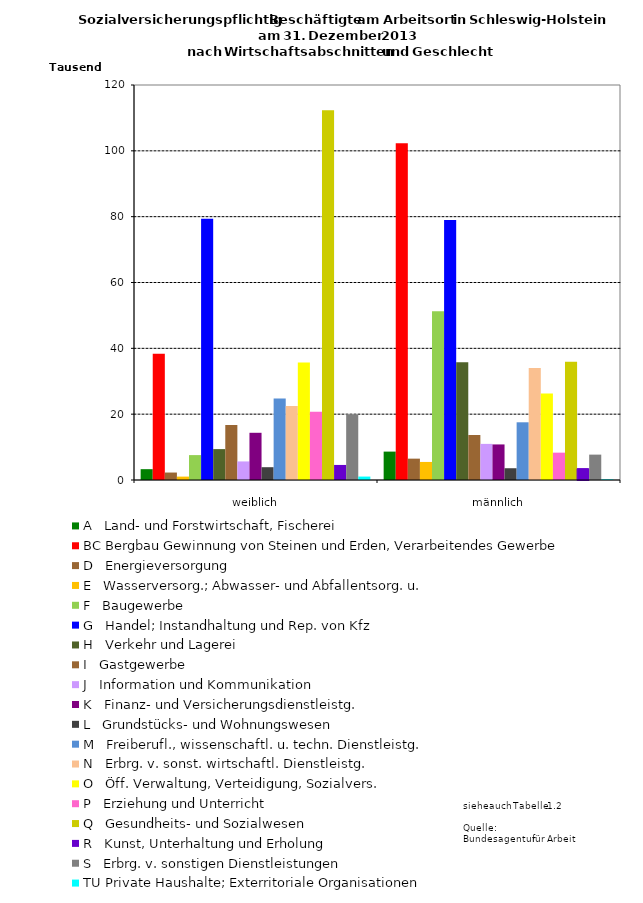
| Category | A   Land- und Forstwirtschaft, Fischerei | BC Bergbau Gewinnung von Steinen und Erden, Verarbeitendes Gewerbe | D   Energieversorgung | E   Wasserversorg.; Abwasser- und Abfallentsorg. u. | F   Baugewerbe | G   Handel; Instandhaltung und Rep. von Kfz | H   Verkehr und Lagerei | I   Gastgewerbe | J   Information und Kommunikation | K   Finanz- und Versicherungsdienstleistg. | L   Grundstücks- und Wohnungswesen | M   Freiberufl., wissenschaftl. u. techn. Dienstleistg. | N   Erbrg. v. sonst. wirtschaftl. Dienstleistg. | O   Öff. Verwaltung, Verteidigung, Sozialvers. | P   Erziehung und Unterricht | Q   Gesundheits- und Sozialwesen | R   Kunst, Unterhaltung und Erholung | S   Erbrg. v. sonstigen Dienstleistungen | TU Private Haushalte; Exterritoriale Organisationen |
|---|---|---|---|---|---|---|---|---|---|---|---|---|---|---|---|---|---|---|---|
| weiblich | 3290 | 38362 | 2268 | 1032 | 7564 | 79351 | 9385 | 16718 | 5641 | 14344 | 3890 | 24770 | 22499 | 35678 | 20707 | 112297 | 4576 | 19995 | 1042 |
| männlich | 8627 | 102273 | 6487 | 5487 | 51285 | 78976 | 35791 | 13664 | 10971 | 10805 | 3575 | 17532 | 33994 | 26290 | 8308 | 35888 | 3451 | 7710 | 210 |